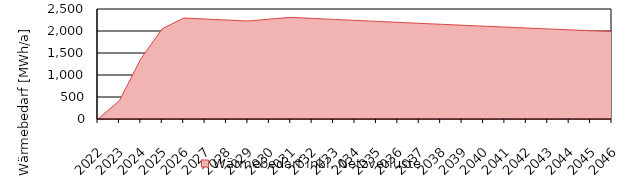
| Category | Wärmebedarf inkl. Netzverluste |
|---|---|
| 2022.0 | 0 |
| 2023.0 | 414.894 |
| 2024.0 | 1368.622 |
| 2025.0 | 2049.869 |
| 2026.0 | 2294.654 |
| 2027.0 | 2271.707 |
| 2028.0 | 2248.99 |
| 2029.0 | 2226.5 |
| 2030.0 | 2268.687 |
| 2031.0 | 2309.807 |
| 2032.0 | 2286.709 |
| 2033.0 | 2263.842 |
| 2034.0 | 2241.203 |
| 2035.0 | 2218.791 |
| 2036.0 | 2196.603 |
| 2037.0 | 2174.637 |
| 2038.0 | 2152.891 |
| 2039.0 | 2131.362 |
| 2040.0 | 2110.048 |
| 2041.0 | 2088.948 |
| 2042.0 | 2068.058 |
| 2043.0 | 2047.378 |
| 2044.0 | 2026.904 |
| 2045.0 | 2006.635 |
| 2046.0 | 1986.569 |